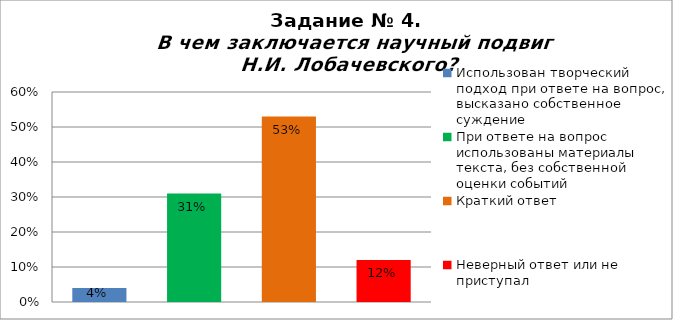
| Category | В чем заключается научный подвиг Н.И. Лобачевского? |
|---|---|
| Использован творческий подход при ответе на вопрос, высказано собственное суждение | 0.04 |
| При ответе на вопрос использованы материалы текста, без собственной оценки событий | 0.31 |
| Краткий ответ | 0.53 |
| Неверный ответ или не приступал | 0.12 |